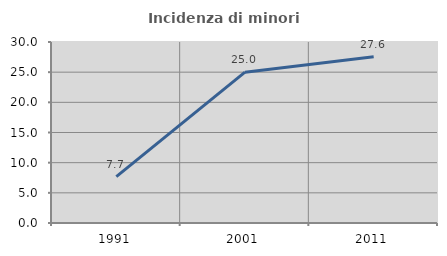
| Category | Incidenza di minori stranieri |
|---|---|
| 1991.0 | 7.692 |
| 2001.0 | 25 |
| 2011.0 | 27.559 |